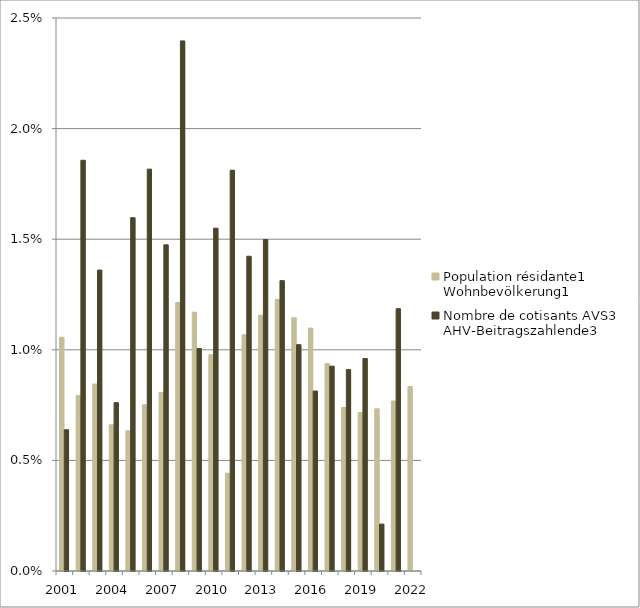
| Category | Population résidante1 | Nombre de cotisants AVS3 |
|---|---|---|
| 2001 | 0.011 | 0.006 |
| 2002 | 0.008 | 0.019 |
| 2003 | 0.008 | 0.014 |
| 2004 | 0.007 | 0.008 |
| 2005 | 0.006 | 0.016 |
| 2006 | 0.008 | 0.018 |
| 2007 | 0.008 | 0.015 |
| 2008 | 0.012 | 0.024 |
| 2009 | 0.012 | 0.01 |
| 2010 | 0.01 | 0.015 |
| 2011 | 0.004 | 0.018 |
| 2012 | 0.011 | 0.014 |
| 2013 | 0.012 | 0.015 |
| 2014 | 0.012 | 0.013 |
| 2015 | 0.011 | 0.01 |
| 2016 | 0.011 | 0.008 |
| 2017 | 0.009 | 0.009 |
| 2018 | 0.007 | 0.009 |
| 2019 | 0.007 | 0.01 |
| 2020 | 0.007 | 0.002 |
| 2021 | 0.008 | 0.012 |
| 2022 | 0.008 | 0 |